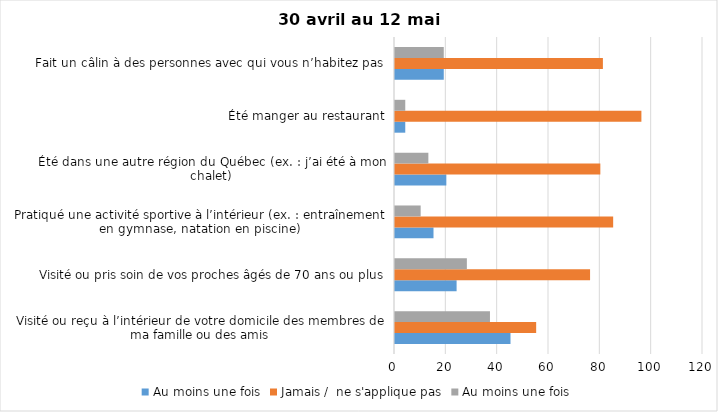
| Category | Au moins une fois | Jamais /  ne s'applique pas |
|---|---|---|
| Visité ou reçu à l’intérieur de votre domicile des membres de ma famille ou des amis | 37 | 55 |
| Visité ou pris soin de vos proches âgés de 70 ans ou plus | 28 | 76 |
| Pratiqué une activité sportive à l’intérieur (ex. : entraînement en gymnase, natation en piscine) | 10 | 85 |
| Été dans une autre région du Québec (ex. : j’ai été à mon chalet) | 13 | 80 |
| Été manger au restaurant | 4 | 96 |
| Fait un câlin à des personnes avec qui vous n’habitez pas | 19 | 81 |